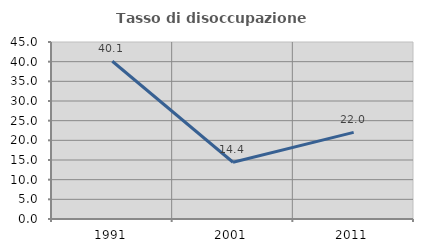
| Category | Tasso di disoccupazione giovanile  |
|---|---|
| 1991.0 | 40.104 |
| 2001.0 | 14.433 |
| 2011.0 | 22.034 |